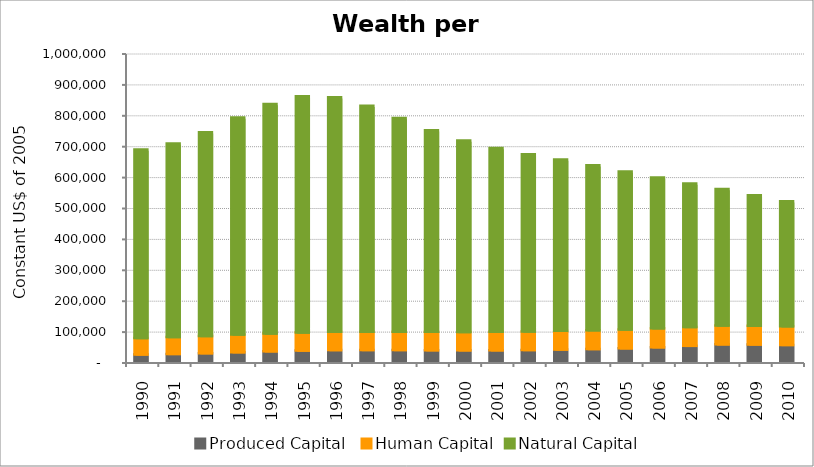
| Category | Produced Capital  | Human Capital | Natural Capital |
|---|---|---|---|
| 1990.0 | 23724.785 | 53083.409 | 610060.859 |
| 1991.0 | 25435.832 | 54492.633 | 626723.554 |
| 1992.0 | 27892.083 | 55791.813 | 659347.628 |
| 1993.0 | 30953.925 | 56986.628 | 702255.8 |
| 1994.0 | 33810.779 | 58009.426 | 742517.964 |
| 1995.0 | 36132.662 | 58679.055 | 764584.895 |
| 1996.0 | 37769.013 | 59073.621 | 759362.571 |
| 1997.0 | 38040.168 | 59281.587 | 731534.606 |
| 1998.0 | 38047.872 | 59335.555 | 691479.875 |
| 1999.0 | 37549.577 | 59308.955 | 652447.248 |
| 2000.0 | 37013.986 | 59278.327 | 619960.764 |
| 2001.0 | 37122.197 | 59764.49 | 594641.443 |
| 2002.0 | 38011.27 | 60252.605 | 573547.518 |
| 2003.0 | 39592.708 | 60726.794 | 554054.933 |
| 2004.0 | 41188.624 | 61013.933 | 533741.661 |
| 2005.0 | 43458.065 | 61035.78 | 511606.312 |
| 2006.0 | 46961.755 | 61117.702 | 488179.077 |
| 2007.0 | 51425.847 | 60978.929 | 464824.244 |
| 2008.0 | 56260.349 | 60664.076 | 442325.176 |
| 2009.0 | 56087.808 | 60412.762 | 422289.075 |
| 2010.0 | 54495.295 | 60261.614 | 404852.574 |